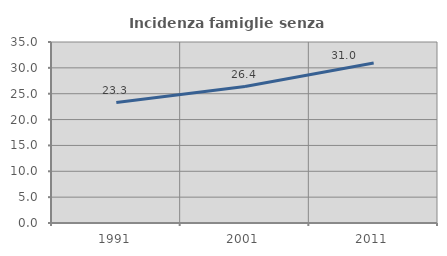
| Category | Incidenza famiglie senza nuclei |
|---|---|
| 1991.0 | 23.285 |
| 2001.0 | 26.381 |
| 2011.0 | 30.956 |